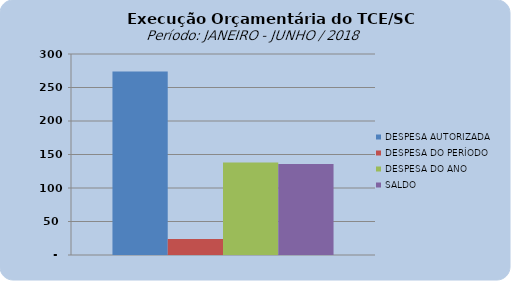
| Category | DESPESA AUTORIZADA | DESPESA DO PERÍODO | DESPESA DO ANO | SALDO |
|---|---|---|---|---|
| 0 | 273897708.09 | 23780214.67 | 138196257.12 | 135701450.97 |